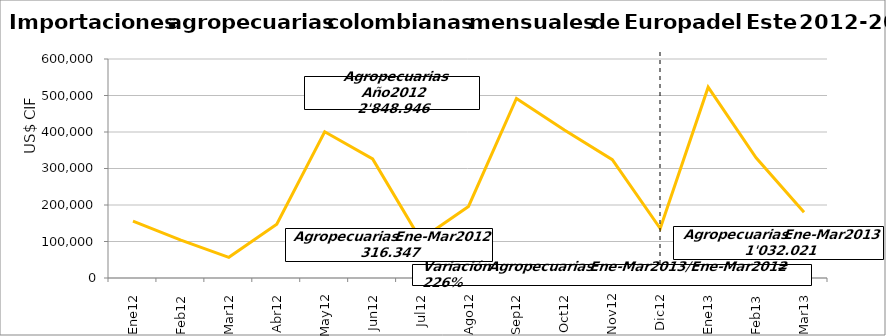
| Category | Agropecuarias |
|---|---|
| 0 | 156000.57 |
| 1 | 103705.73 |
| 2 | 56640.74 |
| 3 | 147255.47 |
| 4 | 400567.73 |
| 5 | 326323.32 |
| 6 | 105192 |
| 7 | 196056.33 |
| 8 | 491863.97 |
| 9 | 405703.65 |
| 10 | 324046.26 |
| 11 | 135590.35 |
| 12 | 522778.09 |
| 13 | 329334.95 |
| 14 | 179908.05 |